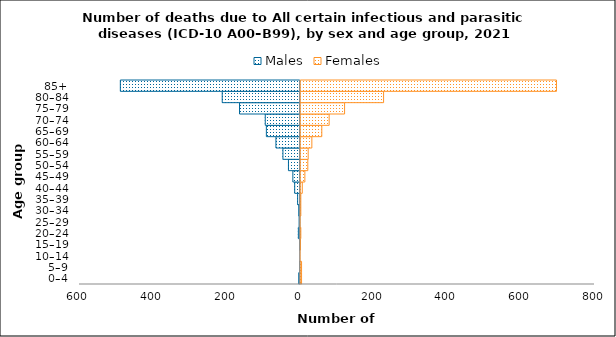
| Category | Males | Females |
|---|---|---|
| 0–4 | -4 | 5 |
| 5–9 | -1 | 5 |
| 10–14 | 0 | 1 |
| 15–19 | -1 | 2 |
| 20–24 | -5 | 3 |
| 25–29 | -3 | 1 |
| 30–34 | -4 | 3 |
| 35–39 | -7 | 3 |
| 40–44 | -15 | 7 |
| 45–49 | -20 | 14 |
| 50–54 | -32 | 22 |
| 55–59 | -47 | 23 |
| 60–64 | -66 | 33 |
| 65–69 | -92 | 60 |
| 70–74 | -95 | 80 |
| 75–79 | -165 | 122 |
| 80–84 | -212 | 228 |
| 85+ | -489 | 698 |